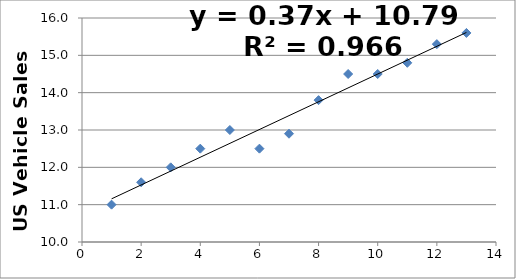
| Category | Series 0 |
|---|---|
| 1.0 | 11 |
| 2.0 | 11.6 |
| 3.0 | 12 |
| 4.0 | 12.5 |
| 5.0 | 13 |
| 6.0 | 12.5 |
| 7.0 | 12.9 |
| 8.0 | 13.8 |
| 9.0 | 14.5 |
| 10.0 | 14.5 |
| 11.0 | 14.8 |
| 12.0 | 15.3 |
| 13.0 | 15.6 |